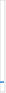
| Category | Caso | Resuelta | Pendiente |
|---|---|---|---|
| Quejas | 0 | 0 | 0 |
| Reclamaciones  | 1 | 1 | 0 |
| Sugerencias | 0 | 0 | 0 |
| Otras | 0 | 0 | 0 |
| Total | 1 | 1 | 0 |